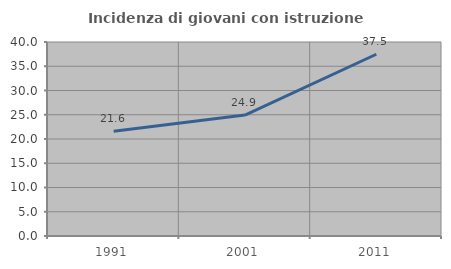
| Category | Incidenza di giovani con istruzione universitaria |
|---|---|
| 1991.0 | 21.613 |
| 2001.0 | 24.938 |
| 2011.0 | 37.472 |